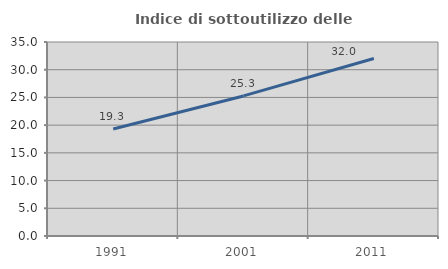
| Category | Indice di sottoutilizzo delle abitazioni  |
|---|---|
| 1991.0 | 19.313 |
| 2001.0 | 25.27 |
| 2011.0 | 32.035 |